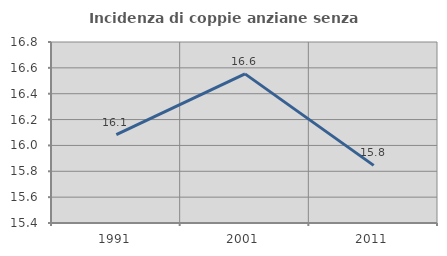
| Category | Incidenza di coppie anziane senza figli  |
|---|---|
| 1991.0 | 16.084 |
| 2001.0 | 16.553 |
| 2011.0 | 15.846 |